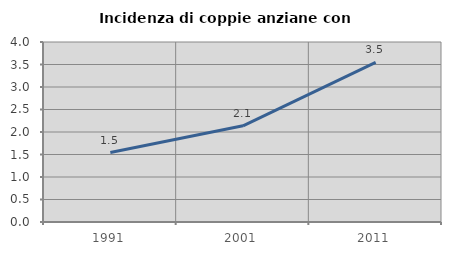
| Category | Incidenza di coppie anziane con figli |
|---|---|
| 1991.0 | 1.544 |
| 2001.0 | 2.138 |
| 2011.0 | 3.545 |